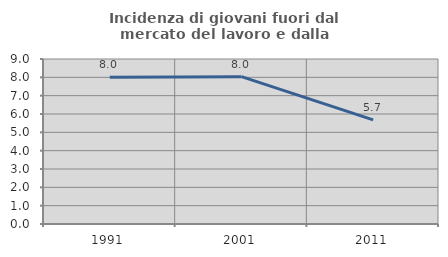
| Category | Incidenza di giovani fuori dal mercato del lavoro e dalla formazione  |
|---|---|
| 1991.0 | 8 |
| 2001.0 | 8.036 |
| 2011.0 | 5.677 |